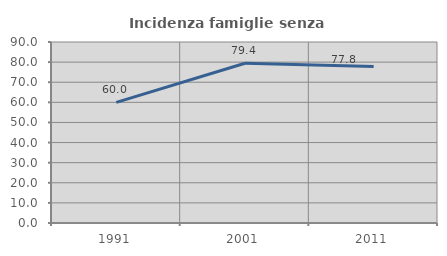
| Category | Incidenza famiglie senza nuclei |
|---|---|
| 1991.0 | 60 |
| 2001.0 | 79.412 |
| 2011.0 | 77.778 |